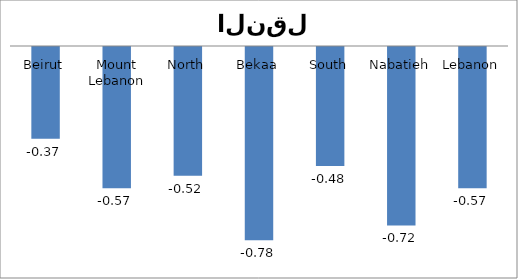
| Category | 07 |
|---|---|
| Beirut | -0.37 |
| Mount Lebanon | -0.57 |
| North | -0.52 |
| Bekaa | -0.78 |
| South | -0.48 |
| Nabatieh | -0.72 |
| Lebanon | -0.57 |